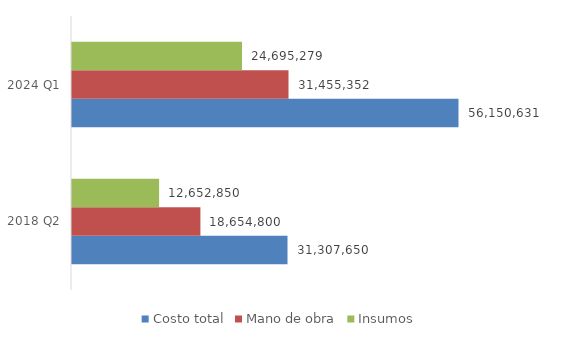
| Category | Costo total | Mano de obra | Insumos |
|---|---|---|---|
| 2018 Q2 | 31307650 | 18654800 | 12652850 |
| 2024 Q1 | 56150630.58 | 31455352 | 24695278.58 |